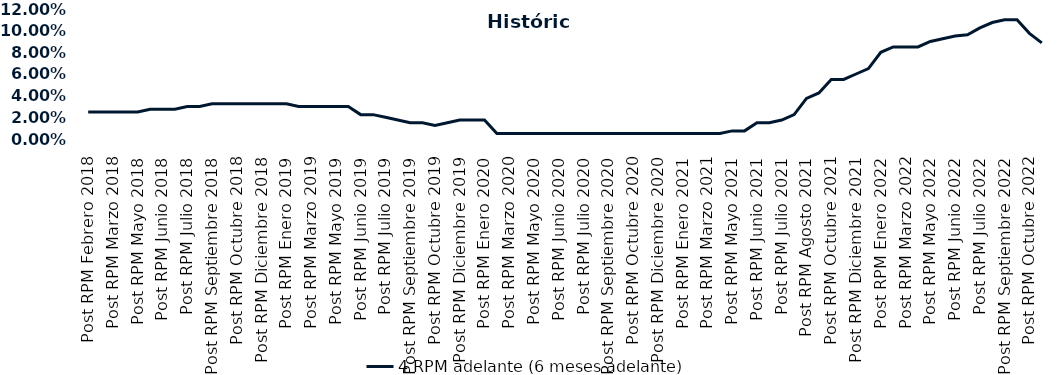
| Category | 4 RPM adelante (6 meses adelante) |
|---|---|
| Post RPM Febrero 2018 | 0.025 |
| Pre RPM Marzo 2018 | 0.025 |
| Post RPM Marzo 2018 | 0.025 |
| Pre RPM Mayo 2018 | 0.025 |
| Post RPM Mayo 2018 | 0.025 |
| Pre RPM Junio 2018 | 0.028 |
| Post RPM Junio 2018 | 0.028 |
| Pre RPM Julio 2018 | 0.028 |
| Post RPM Julio 2018 | 0.03 |
| Pre RPM Septiembre 2018 | 0.03 |
| Post RPM Septiembre 2018 | 0.032 |
| Pre RPM Octubre 2018 | 0.032 |
| Post RPM Octubre 2018 | 0.032 |
| Pre RPM Diciembre 2018 | 0.032 |
| Post RPM Diciembre 2018 | 0.032 |
| Pre RPM Enero 2019 | 0.032 |
| Post RPM Enero 2019 | 0.032 |
| Pre RPM Marzo 2019 | 0.03 |
| Post RPM Marzo 2019 | 0.03 |
| Pre RPM Mayo 2019 | 0.03 |
| Post RPM Mayo 2019 | 0.03 |
| Pre RPM Junio 2019 | 0.03 |
| Post RPM Junio 2019 | 0.022 |
| Pre RPM Julio 2019 | 0.022 |
| Post RPM Julio 2019 | 0.02 |
| Pre RPM Septiembre 2019 | 0.018 |
| Post RPM Septiembre 2019 | 0.015 |
| Pre RPM Octubre 2019 | 0.015 |
| Post RPM Octubre 2019 | 0.012 |
| Pre RPM Diciembre 2019 | 0.015 |
| Post RPM Diciembre 2019 | 0.018 |
| Pre RPM Enero 2020 | 0.018 |
| Post RPM Enero 2020 | 0.018 |
| Pre RPM Marzo 2020 | 0.005 |
| Post RPM Marzo 2020 | 0.005 |
| Pre RPM Mayo 2020 | 0.005 |
| Post RPM Mayo 2020 | 0.005 |
| Pre RPM Junio 2020 | 0.005 |
| Post RPM Junio 2020 | 0.005 |
| Pre RPM Julio 2020 | 0.005 |
| Post RPM Julio 2020 | 0.005 |
| Pre RPM Septiembre 2020 | 0.005 |
| Post RPM Septiembre 2020 | 0.005 |
| Pre RPM Octubre 2020 | 0.005 |
| Post RPM Octubre 2020 | 0.005 |
| Pre RPM Diciembre 2020 | 0.005 |
| Post RPM Diciembre 2020 | 0.005 |
| Pre RPM Enero 2021 | 0.005 |
| Post RPM Enero 2021 | 0.005 |
| Pre RPM Marzo 2021 | 0.005 |
| Post RPM Marzo 2021 | 0.005 |
| Pre RPM Mayo 2021 | 0.005 |
| Post RPM Mayo 2021 | 0.008 |
| Pre RPM Junio 2021 | 0.008 |
| Post RPM Junio 2021 | 0.015 |
| Pre RPM Julio 2021 | 0.015 |
| Post RPM Julio 2021 | 0.018 |
| Pre RPM Agosto 2021 | 0.022 |
| Post RPM Agosto 2021 | 0.038 |
| Pre RPM Octubre 2021 | 0.042 |
| Post RPM Octubre 2021 | 0.055 |
| Pre RPM Diciembre 2021 | 0.055 |
| Post RPM Diciembre 2021 | 0.06 |
| Pre RPM Enero 2022 | 0.065 |
| Post RPM Enero 2022 | 0.08 |
| Pre RPM Marzo 2022 | 0.085 |
| Post RPM Marzo 2022 | 0.085 |
| Pre RPM Mayo 2022 | 0.085 |
| Post RPM Mayo 2022 | 0.09 |
| Pre RPM Junio 2022 | 0.092 |
| Post RPM Junio 2022 | 0.095 |
| Pre RPM Julio 2022 | 0.096 |
| Post RPM Julio 2022 | 0.102 |
| Pre RPM Septiembre 2022 | 0.108 |
| Post RPM Septiembre 2022 | 0.11 |
| Pre RPM Octubre 2022 | 0.11 |
| Post RPM Octubre 2022 | 0.098 |
| Pre RPM Diciembre 2022 | 0.089 |